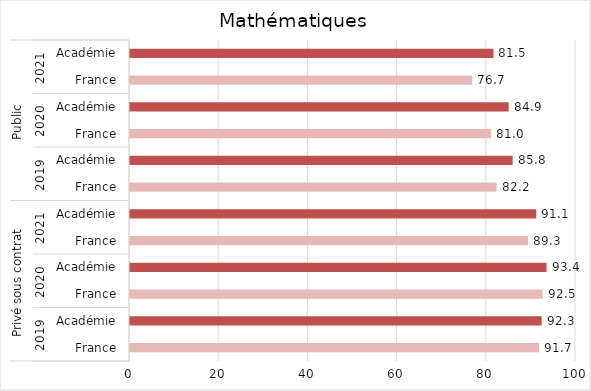
| Category | Mathématiques |
|---|---|
| 0 | 91.7 |
| 1 | 92.3 |
| 2 | 92.5 |
| 3 | 93.4 |
| 4 | 89.3 |
| 5 | 91.1 |
| 6 | 82.2 |
| 7 | 85.8 |
| 8 | 81 |
| 9 | 84.9 |
| 10 | 76.7 |
| 11 | 81.5 |